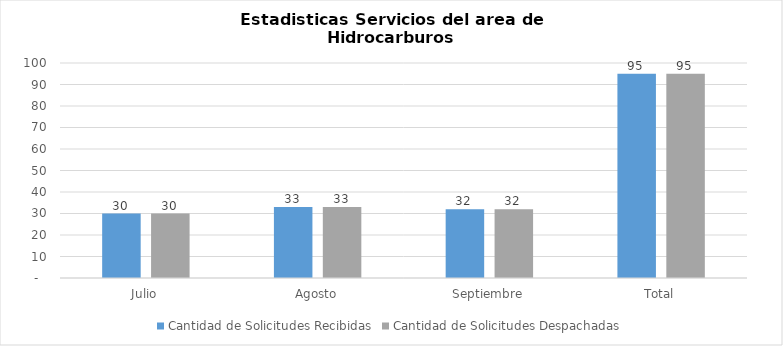
| Category | Cantidad de Solicitudes |
|---|---|
| Julio | 30 |
| Agosto | 33 |
| Septiembre | 32 |
| Total | 95 |